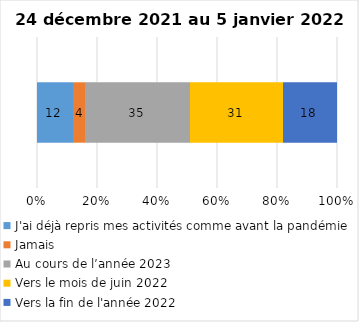
| Category | J'ai déjà repris mes activités comme avant la pandémie | Jamais | Au cours de l’année 2023 | Vers le mois de juin 2022 | Vers la fin de l'année 2022 |
|---|---|---|---|---|---|
| 0 | 12 | 4 | 35 | 31 | 18 |